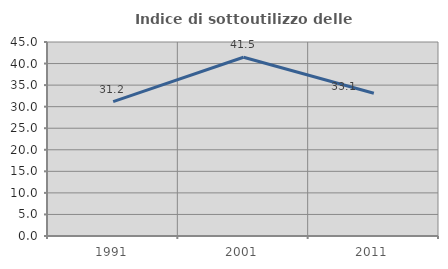
| Category | Indice di sottoutilizzo delle abitazioni  |
|---|---|
| 1991.0 | 31.183 |
| 2001.0 | 41.463 |
| 2011.0 | 33.117 |